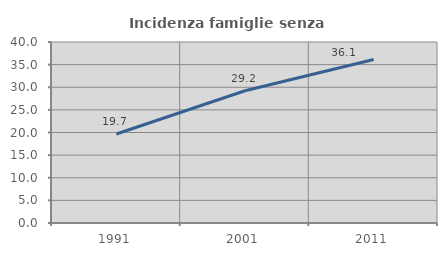
| Category | Incidenza famiglie senza nuclei |
|---|---|
| 1991.0 | 19.667 |
| 2001.0 | 29.217 |
| 2011.0 | 36.134 |